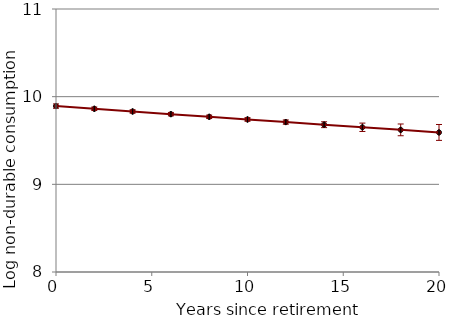
| Category | Series 0 |
|---|---|
| 0.0 | 9.893 |
| 2.0 | 9.862 |
| 4.0 | 9.831 |
| 6.0 | 9.801 |
| 8.0 | 9.77 |
| 10.0 | 9.74 |
| 12.0 | 9.71 |
| 14.0 | 9.68 |
| 16.0 | 9.651 |
| 18.0 | 9.621 |
| 20.0 | 9.592 |